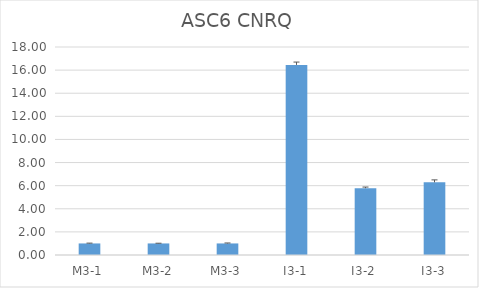
| Category | ASC6 CNRQ |
|---|---|
| M3-1 | 1 |
| M3-2 | 1 |
| M3-3 | 1 |
| I3-1 | 16.45 |
| I3-2 | 5.78 |
| I3-3 | 6.29 |